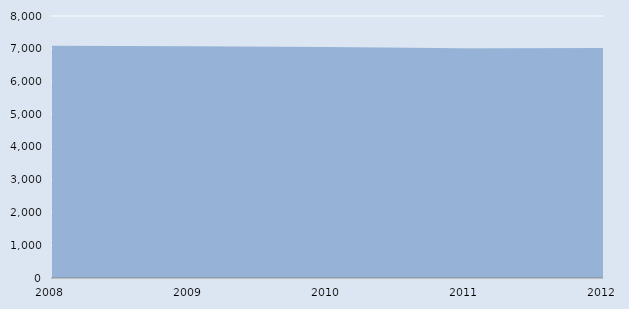
| Category | Series 0 |
|---|---|
| 2008.0 | 7093 |
| 2009.0 | 7080 |
| 2010.0 | 7055 |
| 2011.0 | 7013 |
| 2012.0 | 7023 |